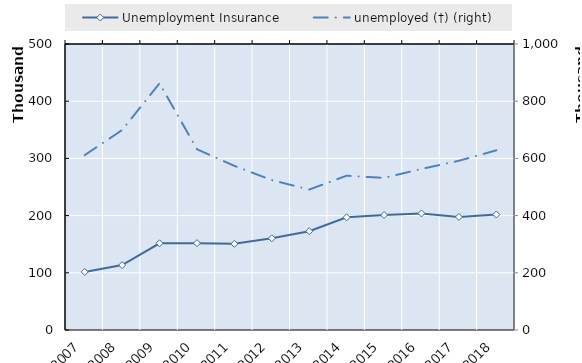
| Category | Survivors' pension from occupational accident insurance | 0 | Series 14 | Series 15 | Series 16 | Series 17 | Series 18 | Series 19 | Unemployment Insurance | Series 1 |
|---|---|---|---|---|---|---|---|---|---|---|
| 2007.0 |  |  |  |  |  |  |  |  | 101541.75 |  |
| 2008.0 |  |  |  |  |  |  |  |  | 113495.246 |  |
| 2009.0 |  |  |  |  |  |  |  |  | 151611.75 |  |
| 2010.0 |  |  |  |  |  |  |  |  | 151850.5 |  |
| 2011.0 |  |  |  |  |  |  |  |  | 150642.5 |  |
| 2012.0 |  |  |  |  |  |  |  |  | 160234.919 |  |
| 2013.0 |  |  |  |  |  |  |  |  | 172796.497 |  |
| 2014.0 |  |  |  |  |  |  |  |  | 196956.744 |  |
| 2015.0 |  |  |  |  |  |  |  |  | 201049 |  |
| 2016.0 |  |  |  |  |  |  |  |  | 203796 |  |
| 2017.0 |  |  |  |  |  |  |  |  | 197701 |  |
| 2018.0 |  |  |  |  |  |  |  |  | 201866.085 |  |